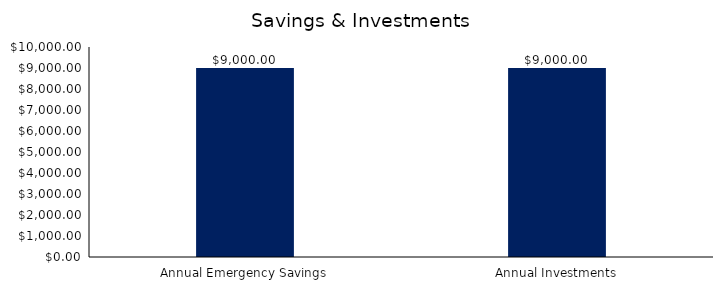
| Category | Series 0 |
|---|---|
| Annual Emergency Savings | 9000 |
| Annual Investments | 9000 |